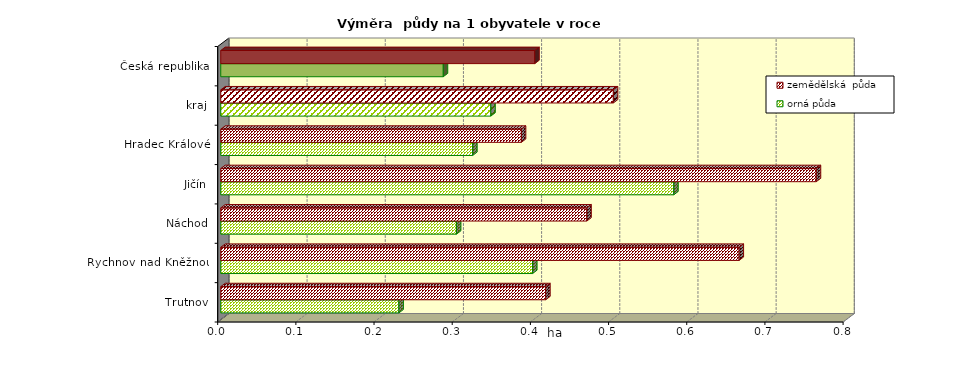
| Category | orná půda | zemědělská  půda |
|---|---|---|
| Trutnov | 0.228 | 0.416 |
| Rychnov nad Kněžnou | 0.399 | 0.663 |
| Náchod | 0.301 | 0.468 |
| Jičín | 0.579 | 0.762 |
| Hradec Králové | 0.322 | 0.385 |
| kraj | 0.345 | 0.502 |
| Česká republika | 0.285 | 0.402 |